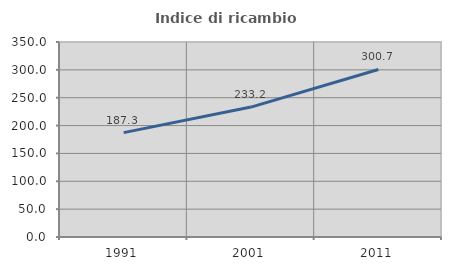
| Category | Indice di ricambio occupazionale  |
|---|---|
| 1991.0 | 187.349 |
| 2001.0 | 233.199 |
| 2011.0 | 300.719 |